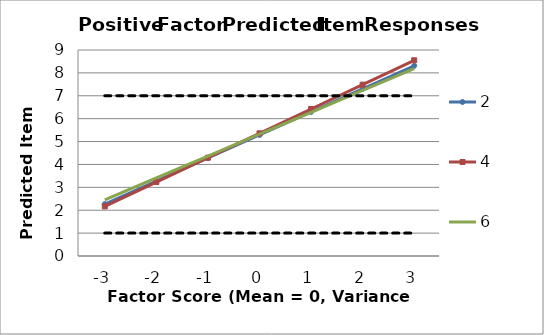
| Category | 2 | 4 | 6 | Lowest | Highest |
|---|---|---|---|---|---|
| -3.0 | 2.268 | 2.167 | 2.453 | 1 | 7 |
| -2.0 | 3.275 | 3.231 | 3.409 | 1 | 7 |
| -1.0 | 4.282 | 4.295 | 4.365 | 1 | 7 |
| 0.0 | 5.289 | 5.359 | 5.321 | 1 | 7 |
| 1.0 | 6.296 | 6.423 | 6.277 | 1 | 7 |
| 2.0 | 7.303 | 7.487 | 7.233 | 1 | 7 |
| 3.0 | 8.31 | 8.551 | 8.189 | 1 | 7 |